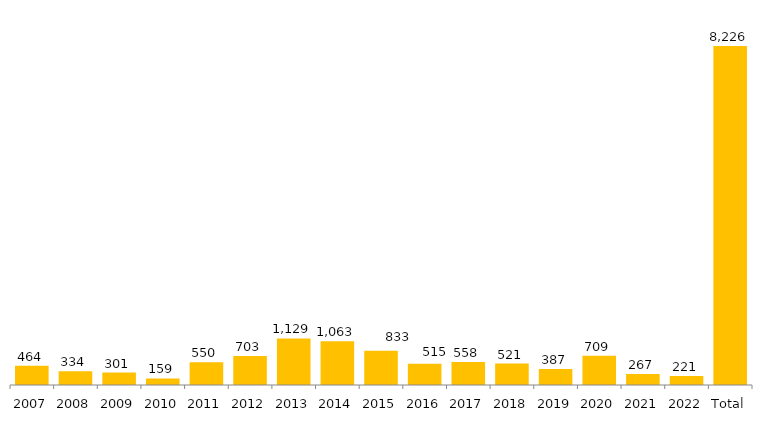
| Category | Total Geral |
|---|---|
| 2007 | 464 |
| 2008 | 334 |
| 2009 | 301 |
| 2010 | 159 |
| 2011 | 550 |
| 2012 | 703 |
| 2013 | 1129 |
| 2014 | 1063 |
| 2015 | 833 |
| 2016 | 515 |
| 2017 | 558 |
| 2018 | 521 |
| 2019 | 387 |
| 2020 | 709 |
| 2021 | 267 |
| 2022 | 221 |
| Total | 8226 |